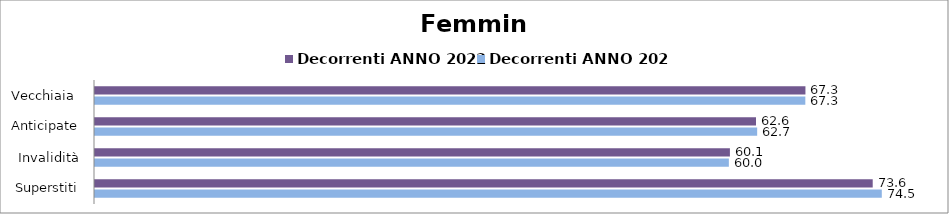
| Category | Decorrenti ANNO 2022 | Decorrenti ANNO 2023 |
|---|---|---|
| Vecchiaia  | 67.26 | 67.25 |
| Anticipate | 62.58 | 62.69 |
| Invalidità | 60.11 | 60.01 |
| Superstiti | 73.63 | 74.49 |